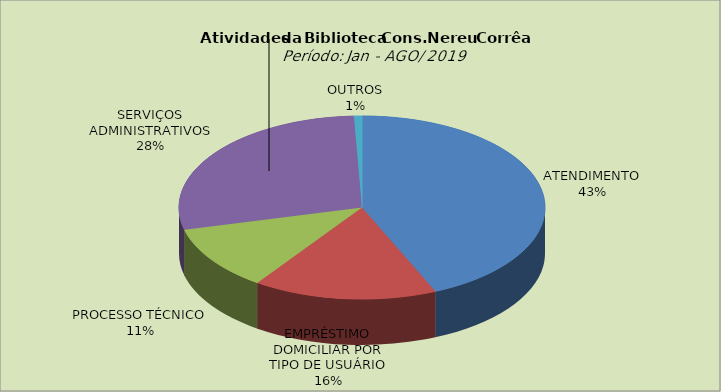
| Category | Series 0 |
|---|---|
| ATENDIMENTO | 43.443 |
| EMPRÉSTIMO DOMICILIAR POR TIPO DE USUÁRIO | 16.224 |
| PROCESSO TÉCNICO | 11.411 |
| SERVIÇOS ADMINISTRATIVOS | 28.212 |
| OUTROS | 0.709 |